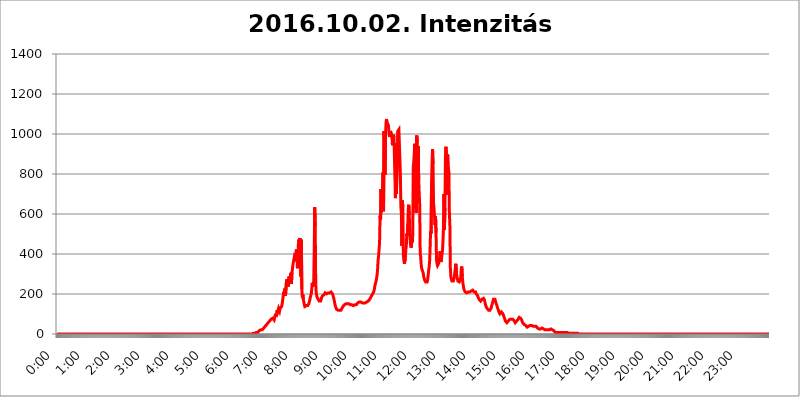
| Category | 2016.10.02. Intenzitás [W/m^2] |
|---|---|
| 0.0 | 0 |
| 0.0006944444444444445 | 0 |
| 0.001388888888888889 | 0 |
| 0.0020833333333333333 | 0 |
| 0.002777777777777778 | 0 |
| 0.003472222222222222 | 0 |
| 0.004166666666666667 | 0 |
| 0.004861111111111111 | 0 |
| 0.005555555555555556 | 0 |
| 0.0062499999999999995 | 0 |
| 0.006944444444444444 | 0 |
| 0.007638888888888889 | 0 |
| 0.008333333333333333 | 0 |
| 0.009027777777777779 | 0 |
| 0.009722222222222222 | 0 |
| 0.010416666666666666 | 0 |
| 0.011111111111111112 | 0 |
| 0.011805555555555555 | 0 |
| 0.012499999999999999 | 0 |
| 0.013194444444444444 | 0 |
| 0.013888888888888888 | 0 |
| 0.014583333333333332 | 0 |
| 0.015277777777777777 | 0 |
| 0.015972222222222224 | 0 |
| 0.016666666666666666 | 0 |
| 0.017361111111111112 | 0 |
| 0.018055555555555557 | 0 |
| 0.01875 | 0 |
| 0.019444444444444445 | 0 |
| 0.02013888888888889 | 0 |
| 0.020833333333333332 | 0 |
| 0.02152777777777778 | 0 |
| 0.022222222222222223 | 0 |
| 0.02291666666666667 | 0 |
| 0.02361111111111111 | 0 |
| 0.024305555555555556 | 0 |
| 0.024999999999999998 | 0 |
| 0.025694444444444447 | 0 |
| 0.02638888888888889 | 0 |
| 0.027083333333333334 | 0 |
| 0.027777777777777776 | 0 |
| 0.02847222222222222 | 0 |
| 0.029166666666666664 | 0 |
| 0.029861111111111113 | 0 |
| 0.030555555555555555 | 0 |
| 0.03125 | 0 |
| 0.03194444444444445 | 0 |
| 0.03263888888888889 | 0 |
| 0.03333333333333333 | 0 |
| 0.034027777777777775 | 0 |
| 0.034722222222222224 | 0 |
| 0.035416666666666666 | 0 |
| 0.036111111111111115 | 0 |
| 0.03680555555555556 | 0 |
| 0.0375 | 0 |
| 0.03819444444444444 | 0 |
| 0.03888888888888889 | 0 |
| 0.03958333333333333 | 0 |
| 0.04027777777777778 | 0 |
| 0.04097222222222222 | 0 |
| 0.041666666666666664 | 0 |
| 0.042361111111111106 | 0 |
| 0.04305555555555556 | 0 |
| 0.043750000000000004 | 0 |
| 0.044444444444444446 | 0 |
| 0.04513888888888889 | 0 |
| 0.04583333333333334 | 0 |
| 0.04652777777777778 | 0 |
| 0.04722222222222222 | 0 |
| 0.04791666666666666 | 0 |
| 0.04861111111111111 | 0 |
| 0.049305555555555554 | 0 |
| 0.049999999999999996 | 0 |
| 0.05069444444444445 | 0 |
| 0.051388888888888894 | 0 |
| 0.052083333333333336 | 0 |
| 0.05277777777777778 | 0 |
| 0.05347222222222222 | 0 |
| 0.05416666666666667 | 0 |
| 0.05486111111111111 | 0 |
| 0.05555555555555555 | 0 |
| 0.05625 | 0 |
| 0.05694444444444444 | 0 |
| 0.057638888888888885 | 0 |
| 0.05833333333333333 | 0 |
| 0.05902777777777778 | 0 |
| 0.059722222222222225 | 0 |
| 0.06041666666666667 | 0 |
| 0.061111111111111116 | 0 |
| 0.06180555555555556 | 0 |
| 0.0625 | 0 |
| 0.06319444444444444 | 0 |
| 0.06388888888888888 | 0 |
| 0.06458333333333334 | 0 |
| 0.06527777777777778 | 0 |
| 0.06597222222222222 | 0 |
| 0.06666666666666667 | 0 |
| 0.06736111111111111 | 0 |
| 0.06805555555555555 | 0 |
| 0.06874999999999999 | 0 |
| 0.06944444444444443 | 0 |
| 0.07013888888888889 | 0 |
| 0.07083333333333333 | 0 |
| 0.07152777777777779 | 0 |
| 0.07222222222222223 | 0 |
| 0.07291666666666667 | 0 |
| 0.07361111111111111 | 0 |
| 0.07430555555555556 | 0 |
| 0.075 | 0 |
| 0.07569444444444444 | 0 |
| 0.0763888888888889 | 0 |
| 0.07708333333333334 | 0 |
| 0.07777777777777778 | 0 |
| 0.07847222222222222 | 0 |
| 0.07916666666666666 | 0 |
| 0.0798611111111111 | 0 |
| 0.08055555555555556 | 0 |
| 0.08125 | 0 |
| 0.08194444444444444 | 0 |
| 0.08263888888888889 | 0 |
| 0.08333333333333333 | 0 |
| 0.08402777777777777 | 0 |
| 0.08472222222222221 | 0 |
| 0.08541666666666665 | 0 |
| 0.08611111111111112 | 0 |
| 0.08680555555555557 | 0 |
| 0.08750000000000001 | 0 |
| 0.08819444444444445 | 0 |
| 0.08888888888888889 | 0 |
| 0.08958333333333333 | 0 |
| 0.09027777777777778 | 0 |
| 0.09097222222222222 | 0 |
| 0.09166666666666667 | 0 |
| 0.09236111111111112 | 0 |
| 0.09305555555555556 | 0 |
| 0.09375 | 0 |
| 0.09444444444444444 | 0 |
| 0.09513888888888888 | 0 |
| 0.09583333333333333 | 0 |
| 0.09652777777777777 | 0 |
| 0.09722222222222222 | 0 |
| 0.09791666666666667 | 0 |
| 0.09861111111111111 | 0 |
| 0.09930555555555555 | 0 |
| 0.09999999999999999 | 0 |
| 0.10069444444444443 | 0 |
| 0.1013888888888889 | 0 |
| 0.10208333333333335 | 0 |
| 0.10277777777777779 | 0 |
| 0.10347222222222223 | 0 |
| 0.10416666666666667 | 0 |
| 0.10486111111111111 | 0 |
| 0.10555555555555556 | 0 |
| 0.10625 | 0 |
| 0.10694444444444444 | 0 |
| 0.1076388888888889 | 0 |
| 0.10833333333333334 | 0 |
| 0.10902777777777778 | 0 |
| 0.10972222222222222 | 0 |
| 0.1111111111111111 | 0 |
| 0.11180555555555556 | 0 |
| 0.11180555555555556 | 0 |
| 0.1125 | 0 |
| 0.11319444444444444 | 0 |
| 0.11388888888888889 | 0 |
| 0.11458333333333333 | 0 |
| 0.11527777777777777 | 0 |
| 0.11597222222222221 | 0 |
| 0.11666666666666665 | 0 |
| 0.1173611111111111 | 0 |
| 0.11805555555555557 | 0 |
| 0.11944444444444445 | 0 |
| 0.12013888888888889 | 0 |
| 0.12083333333333333 | 0 |
| 0.12152777777777778 | 0 |
| 0.12222222222222223 | 0 |
| 0.12291666666666667 | 0 |
| 0.12291666666666667 | 0 |
| 0.12361111111111112 | 0 |
| 0.12430555555555556 | 0 |
| 0.125 | 0 |
| 0.12569444444444444 | 0 |
| 0.12638888888888888 | 0 |
| 0.12708333333333333 | 0 |
| 0.16875 | 0 |
| 0.12847222222222224 | 0 |
| 0.12916666666666668 | 0 |
| 0.12986111111111112 | 0 |
| 0.13055555555555556 | 0 |
| 0.13125 | 0 |
| 0.13194444444444445 | 0 |
| 0.1326388888888889 | 0 |
| 0.13333333333333333 | 0 |
| 0.13402777777777777 | 0 |
| 0.13402777777777777 | 0 |
| 0.13472222222222222 | 0 |
| 0.13541666666666666 | 0 |
| 0.1361111111111111 | 0 |
| 0.13749999999999998 | 0 |
| 0.13819444444444443 | 0 |
| 0.1388888888888889 | 0 |
| 0.13958333333333334 | 0 |
| 0.14027777777777778 | 0 |
| 0.14097222222222222 | 0 |
| 0.14166666666666666 | 0 |
| 0.1423611111111111 | 0 |
| 0.14305555555555557 | 0 |
| 0.14375000000000002 | 0 |
| 0.14444444444444446 | 0 |
| 0.1451388888888889 | 0 |
| 0.1451388888888889 | 0 |
| 0.14652777777777778 | 0 |
| 0.14722222222222223 | 0 |
| 0.14791666666666667 | 0 |
| 0.1486111111111111 | 0 |
| 0.14930555555555555 | 0 |
| 0.15 | 0 |
| 0.15069444444444444 | 0 |
| 0.15138888888888888 | 0 |
| 0.15208333333333332 | 0 |
| 0.15277777777777776 | 0 |
| 0.15347222222222223 | 0 |
| 0.15416666666666667 | 0 |
| 0.15486111111111112 | 0 |
| 0.15555555555555556 | 0 |
| 0.15625 | 0 |
| 0.15694444444444444 | 0 |
| 0.15763888888888888 | 0 |
| 0.15833333333333333 | 0 |
| 0.15902777777777777 | 0 |
| 0.15972222222222224 | 0 |
| 0.16041666666666668 | 0 |
| 0.16111111111111112 | 0 |
| 0.16180555555555556 | 0 |
| 0.1625 | 0 |
| 0.16319444444444445 | 0 |
| 0.1638888888888889 | 0 |
| 0.16458333333333333 | 0 |
| 0.16527777777777777 | 0 |
| 0.16597222222222222 | 0 |
| 0.16666666666666666 | 0 |
| 0.1673611111111111 | 0 |
| 0.16805555555555554 | 0 |
| 0.16874999999999998 | 0 |
| 0.16944444444444443 | 0 |
| 0.17013888888888887 | 0 |
| 0.1708333333333333 | 0 |
| 0.17152777777777775 | 0 |
| 0.17222222222222225 | 0 |
| 0.1729166666666667 | 0 |
| 0.17361111111111113 | 0 |
| 0.17430555555555557 | 0 |
| 0.17500000000000002 | 0 |
| 0.17569444444444446 | 0 |
| 0.1763888888888889 | 0 |
| 0.17708333333333334 | 0 |
| 0.17777777777777778 | 0 |
| 0.17847222222222223 | 0 |
| 0.17916666666666667 | 0 |
| 0.1798611111111111 | 0 |
| 0.18055555555555555 | 0 |
| 0.18125 | 0 |
| 0.18194444444444444 | 0 |
| 0.1826388888888889 | 0 |
| 0.18333333333333335 | 0 |
| 0.1840277777777778 | 0 |
| 0.18472222222222223 | 0 |
| 0.18541666666666667 | 0 |
| 0.18611111111111112 | 0 |
| 0.18680555555555556 | 0 |
| 0.1875 | 0 |
| 0.18819444444444444 | 0 |
| 0.18888888888888888 | 0 |
| 0.18958333333333333 | 0 |
| 0.19027777777777777 | 0 |
| 0.1909722222222222 | 0 |
| 0.19166666666666665 | 0 |
| 0.19236111111111112 | 0 |
| 0.19305555555555554 | 0 |
| 0.19375 | 0 |
| 0.19444444444444445 | 0 |
| 0.1951388888888889 | 0 |
| 0.19583333333333333 | 0 |
| 0.19652777777777777 | 0 |
| 0.19722222222222222 | 0 |
| 0.19791666666666666 | 0 |
| 0.1986111111111111 | 0 |
| 0.19930555555555554 | 0 |
| 0.19999999999999998 | 0 |
| 0.20069444444444443 | 0 |
| 0.20138888888888887 | 0 |
| 0.2020833333333333 | 0 |
| 0.2027777777777778 | 0 |
| 0.2034722222222222 | 0 |
| 0.2041666666666667 | 0 |
| 0.20486111111111113 | 0 |
| 0.20555555555555557 | 0 |
| 0.20625000000000002 | 0 |
| 0.20694444444444446 | 0 |
| 0.2076388888888889 | 0 |
| 0.20833333333333334 | 0 |
| 0.20902777777777778 | 0 |
| 0.20972222222222223 | 0 |
| 0.21041666666666667 | 0 |
| 0.2111111111111111 | 0 |
| 0.21180555555555555 | 0 |
| 0.2125 | 0 |
| 0.21319444444444444 | 0 |
| 0.2138888888888889 | 0 |
| 0.21458333333333335 | 0 |
| 0.2152777777777778 | 0 |
| 0.21597222222222223 | 0 |
| 0.21666666666666667 | 0 |
| 0.21736111111111112 | 0 |
| 0.21805555555555556 | 0 |
| 0.21875 | 0 |
| 0.21944444444444444 | 0 |
| 0.22013888888888888 | 0 |
| 0.22083333333333333 | 0 |
| 0.22152777777777777 | 0 |
| 0.2222222222222222 | 0 |
| 0.22291666666666665 | 0 |
| 0.2236111111111111 | 0 |
| 0.22430555555555556 | 0 |
| 0.225 | 0 |
| 0.22569444444444445 | 0 |
| 0.2263888888888889 | 0 |
| 0.22708333333333333 | 0 |
| 0.22777777777777777 | 0 |
| 0.22847222222222222 | 0 |
| 0.22916666666666666 | 0 |
| 0.2298611111111111 | 0 |
| 0.23055555555555554 | 0 |
| 0.23124999999999998 | 0 |
| 0.23194444444444443 | 0 |
| 0.23263888888888887 | 0 |
| 0.2333333333333333 | 0 |
| 0.2340277777777778 | 0 |
| 0.2347222222222222 | 0 |
| 0.2354166666666667 | 0 |
| 0.23611111111111113 | 0 |
| 0.23680555555555557 | 0 |
| 0.23750000000000002 | 0 |
| 0.23819444444444446 | 0 |
| 0.2388888888888889 | 0 |
| 0.23958333333333334 | 0 |
| 0.24027777777777778 | 0 |
| 0.24097222222222223 | 0 |
| 0.24166666666666667 | 0 |
| 0.2423611111111111 | 0 |
| 0.24305555555555555 | 0 |
| 0.24375 | 0 |
| 0.24444444444444446 | 0 |
| 0.24513888888888888 | 0 |
| 0.24583333333333335 | 0 |
| 0.2465277777777778 | 0 |
| 0.24722222222222223 | 0 |
| 0.24791666666666667 | 0 |
| 0.24861111111111112 | 0 |
| 0.24930555555555556 | 0 |
| 0.25 | 0 |
| 0.25069444444444444 | 0 |
| 0.2513888888888889 | 0 |
| 0.2520833333333333 | 0 |
| 0.25277777777777777 | 0 |
| 0.2534722222222222 | 0 |
| 0.25416666666666665 | 0 |
| 0.2548611111111111 | 0 |
| 0.2555555555555556 | 0 |
| 0.25625000000000003 | 0 |
| 0.2569444444444445 | 0 |
| 0.2576388888888889 | 0 |
| 0.25833333333333336 | 0 |
| 0.2590277777777778 | 0 |
| 0.25972222222222224 | 0 |
| 0.2604166666666667 | 0 |
| 0.2611111111111111 | 0 |
| 0.26180555555555557 | 0 |
| 0.2625 | 0 |
| 0.26319444444444445 | 0 |
| 0.2638888888888889 | 0 |
| 0.26458333333333334 | 0 |
| 0.2652777777777778 | 0 |
| 0.2659722222222222 | 0 |
| 0.26666666666666666 | 0 |
| 0.2673611111111111 | 0 |
| 0.26805555555555555 | 0 |
| 0.26875 | 0 |
| 0.26944444444444443 | 0 |
| 0.2701388888888889 | 0 |
| 0.2708333333333333 | 0 |
| 0.27152777777777776 | 0 |
| 0.2722222222222222 | 3.525 |
| 0.27291666666666664 | 0 |
| 0.2736111111111111 | 3.525 |
| 0.2743055555555555 | 3.525 |
| 0.27499999999999997 | 3.525 |
| 0.27569444444444446 | 3.525 |
| 0.27638888888888885 | 3.525 |
| 0.27708333333333335 | 3.525 |
| 0.2777777777777778 | 3.525 |
| 0.27847222222222223 | 7.887 |
| 0.2791666666666667 | 7.887 |
| 0.2798611111111111 | 7.887 |
| 0.28055555555555556 | 7.887 |
| 0.28125 | 7.887 |
| 0.28194444444444444 | 12.257 |
| 0.2826388888888889 | 12.257 |
| 0.2833333333333333 | 16.636 |
| 0.28402777777777777 | 16.636 |
| 0.2847222222222222 | 21.024 |
| 0.28541666666666665 | 21.024 |
| 0.28611111111111115 | 21.024 |
| 0.28680555555555554 | 21.024 |
| 0.28750000000000003 | 21.024 |
| 0.2881944444444445 | 25.419 |
| 0.2888888888888889 | 25.419 |
| 0.28958333333333336 | 29.823 |
| 0.2902777777777778 | 29.823 |
| 0.29097222222222224 | 34.234 |
| 0.2916666666666667 | 38.653 |
| 0.2923611111111111 | 43.079 |
| 0.29305555555555557 | 43.079 |
| 0.29375 | 47.511 |
| 0.29444444444444445 | 47.511 |
| 0.2951388888888889 | 51.951 |
| 0.29583333333333334 | 56.398 |
| 0.2965277777777778 | 56.398 |
| 0.2972222222222222 | 60.85 |
| 0.29791666666666666 | 65.31 |
| 0.2986111111111111 | 65.31 |
| 0.29930555555555555 | 69.775 |
| 0.3 | 74.246 |
| 0.30069444444444443 | 74.246 |
| 0.3013888888888889 | 74.246 |
| 0.3020833333333333 | 78.722 |
| 0.30277777777777776 | 83.205 |
| 0.3034722222222222 | 78.722 |
| 0.30416666666666664 | 69.775 |
| 0.3048611111111111 | 74.246 |
| 0.3055555555555555 | 92.184 |
| 0.30624999999999997 | 101.184 |
| 0.3069444444444444 | 87.692 |
| 0.3076388888888889 | 101.184 |
| 0.30833333333333335 | 119.235 |
| 0.3090277777777778 | 110.201 |
| 0.30972222222222223 | 114.716 |
| 0.3104166666666667 | 128.284 |
| 0.3111111111111111 | 128.284 |
| 0.31180555555555556 | 114.716 |
| 0.3125 | 128.284 |
| 0.31319444444444444 | 123.758 |
| 0.3138888888888889 | 128.284 |
| 0.3145833333333333 | 137.347 |
| 0.31527777777777777 | 146.423 |
| 0.3159722222222222 | 150.964 |
| 0.31666666666666665 | 182.82 |
| 0.31736111111111115 | 205.62 |
| 0.31805555555555554 | 210.182 |
| 0.31875000000000003 | 214.746 |
| 0.3194444444444445 | 228.436 |
| 0.3201388888888889 | 191.937 |
| 0.32083333333333336 | 187.378 |
| 0.3215277777777778 | 264.932 |
| 0.32222222222222224 | 274.047 |
| 0.3229166666666667 | 269.49 |
| 0.3236111111111111 | 274.047 |
| 0.32430555555555557 | 237.564 |
| 0.325 | 287.709 |
| 0.32569444444444445 | 287.709 |
| 0.3263888888888889 | 274.047 |
| 0.32708333333333334 | 255.813 |
| 0.3277777777777778 | 305.898 |
| 0.3284722222222222 | 251.251 |
| 0.32916666666666666 | 305.898 |
| 0.3298611111111111 | 324.052 |
| 0.33055555555555555 | 346.682 |
| 0.33125 | 351.198 |
| 0.33194444444444443 | 373.729 |
| 0.3326388888888889 | 387.202 |
| 0.3333333333333333 | 387.202 |
| 0.3340277777777778 | 378.224 |
| 0.3347222222222222 | 405.108 |
| 0.3354166666666667 | 422.943 |
| 0.3361111111111111 | 387.202 |
| 0.3368055555555556 | 328.584 |
| 0.33749999999999997 | 387.202 |
| 0.33819444444444446 | 449.551 |
| 0.33888888888888885 | 471.582 |
| 0.33958333333333335 | 431.833 |
| 0.34027777777777773 | 480.356 |
| 0.34097222222222223 | 378.224 |
| 0.3416666666666666 | 287.709 |
| 0.3423611111111111 | 471.582 |
| 0.3430555555555555 | 223.873 |
| 0.34375 | 182.82 |
| 0.3444444444444445 | 196.497 |
| 0.3451388888888889 | 173.709 |
| 0.3458333333333334 | 160.056 |
| 0.34652777777777777 | 146.423 |
| 0.34722222222222227 | 137.347 |
| 0.34791666666666665 | 141.884 |
| 0.34861111111111115 | 141.884 |
| 0.34930555555555554 | 141.884 |
| 0.35000000000000003 | 141.884 |
| 0.3506944444444444 | 141.884 |
| 0.3513888888888889 | 141.884 |
| 0.3520833333333333 | 146.423 |
| 0.3527777777777778 | 150.964 |
| 0.3534722222222222 | 160.056 |
| 0.3541666666666667 | 169.156 |
| 0.3548611111111111 | 182.82 |
| 0.35555555555555557 | 182.82 |
| 0.35625 | 201.058 |
| 0.35694444444444445 | 223.873 |
| 0.3576388888888889 | 255.813 |
| 0.35833333333333334 | 237.564 |
| 0.3590277777777778 | 233 |
| 0.3597222222222222 | 260.373 |
| 0.36041666666666666 | 418.492 |
| 0.3611111111111111 | 634.105 |
| 0.36180555555555555 | 541.121 |
| 0.3625 | 255.813 |
| 0.36319444444444443 | 205.62 |
| 0.3638888888888889 | 191.937 |
| 0.3645833333333333 | 182.82 |
| 0.3652777777777778 | 178.264 |
| 0.3659722222222222 | 173.709 |
| 0.3666666666666667 | 169.156 |
| 0.3673611111111111 | 164.605 |
| 0.3680555555555556 | 164.605 |
| 0.36874999999999997 | 164.605 |
| 0.36944444444444446 | 164.605 |
| 0.37013888888888885 | 173.709 |
| 0.37083333333333335 | 182.82 |
| 0.37152777777777773 | 187.378 |
| 0.37222222222222223 | 191.937 |
| 0.3729166666666666 | 196.497 |
| 0.3736111111111111 | 191.937 |
| 0.3743055555555555 | 196.497 |
| 0.375 | 201.058 |
| 0.3756944444444445 | 205.62 |
| 0.3763888888888889 | 210.182 |
| 0.3770833333333334 | 205.62 |
| 0.37777777777777777 | 201.058 |
| 0.37847222222222227 | 201.058 |
| 0.37916666666666665 | 205.62 |
| 0.37986111111111115 | 205.62 |
| 0.38055555555555554 | 205.62 |
| 0.38125000000000003 | 205.62 |
| 0.3819444444444444 | 205.62 |
| 0.3826388888888889 | 205.62 |
| 0.3833333333333333 | 210.182 |
| 0.3840277777777778 | 210.182 |
| 0.3847222222222222 | 214.746 |
| 0.3854166666666667 | 210.182 |
| 0.3861111111111111 | 201.058 |
| 0.38680555555555557 | 196.497 |
| 0.3875 | 182.82 |
| 0.38819444444444445 | 173.709 |
| 0.3888888888888889 | 160.056 |
| 0.38958333333333334 | 146.423 |
| 0.3902777777777778 | 137.347 |
| 0.3909722222222222 | 132.814 |
| 0.39166666666666666 | 123.758 |
| 0.3923611111111111 | 119.235 |
| 0.39305555555555555 | 119.235 |
| 0.39375 | 119.235 |
| 0.39444444444444443 | 119.235 |
| 0.3951388888888889 | 119.235 |
| 0.3958333333333333 | 119.235 |
| 0.3965277777777778 | 119.235 |
| 0.3972222222222222 | 119.235 |
| 0.3979166666666667 | 119.235 |
| 0.3986111111111111 | 123.758 |
| 0.3993055555555556 | 128.284 |
| 0.39999999999999997 | 128.284 |
| 0.40069444444444446 | 137.347 |
| 0.40138888888888885 | 137.347 |
| 0.40208333333333335 | 141.884 |
| 0.40277777777777773 | 146.423 |
| 0.40347222222222223 | 146.423 |
| 0.4041666666666666 | 150.964 |
| 0.4048611111111111 | 150.964 |
| 0.4055555555555555 | 150.964 |
| 0.40625 | 150.964 |
| 0.4069444444444445 | 150.964 |
| 0.4076388888888889 | 150.964 |
| 0.4083333333333334 | 150.964 |
| 0.40902777777777777 | 150.964 |
| 0.40972222222222227 | 146.423 |
| 0.41041666666666665 | 150.964 |
| 0.41111111111111115 | 146.423 |
| 0.41180555555555554 | 146.423 |
| 0.41250000000000003 | 146.423 |
| 0.4131944444444444 | 146.423 |
| 0.4138888888888889 | 146.423 |
| 0.4145833333333333 | 141.884 |
| 0.4152777777777778 | 141.884 |
| 0.4159722222222222 | 141.884 |
| 0.4166666666666667 | 141.884 |
| 0.4173611111111111 | 146.423 |
| 0.41805555555555557 | 146.423 |
| 0.41875 | 146.423 |
| 0.41944444444444445 | 146.423 |
| 0.4201388888888889 | 150.964 |
| 0.42083333333333334 | 150.964 |
| 0.4215277777777778 | 155.509 |
| 0.4222222222222222 | 155.509 |
| 0.42291666666666666 | 155.509 |
| 0.4236111111111111 | 160.056 |
| 0.42430555555555555 | 160.056 |
| 0.425 | 160.056 |
| 0.42569444444444443 | 160.056 |
| 0.4263888888888889 | 155.509 |
| 0.4270833333333333 | 155.509 |
| 0.4277777777777778 | 155.509 |
| 0.4284722222222222 | 155.509 |
| 0.4291666666666667 | 155.509 |
| 0.4298611111111111 | 155.509 |
| 0.4305555555555556 | 155.509 |
| 0.43124999999999997 | 155.509 |
| 0.43194444444444446 | 155.509 |
| 0.43263888888888885 | 155.509 |
| 0.43333333333333335 | 155.509 |
| 0.43402777777777773 | 160.056 |
| 0.43472222222222223 | 160.056 |
| 0.4354166666666666 | 164.605 |
| 0.4361111111111111 | 164.605 |
| 0.4368055555555555 | 169.156 |
| 0.4375 | 169.156 |
| 0.4381944444444445 | 173.709 |
| 0.4388888888888889 | 178.264 |
| 0.4395833333333334 | 182.82 |
| 0.44027777777777777 | 187.378 |
| 0.44097222222222227 | 191.937 |
| 0.44166666666666665 | 196.497 |
| 0.44236111111111115 | 201.058 |
| 0.44305555555555554 | 205.62 |
| 0.44375000000000003 | 210.182 |
| 0.4444444444444444 | 219.309 |
| 0.4451388888888889 | 233 |
| 0.4458333333333333 | 246.689 |
| 0.4465277777777778 | 255.813 |
| 0.4472222222222222 | 264.932 |
| 0.4479166666666667 | 278.603 |
| 0.4486111111111111 | 296.808 |
| 0.44930555555555557 | 324.052 |
| 0.45 | 369.23 |
| 0.45069444444444445 | 391.685 |
| 0.4513888888888889 | 422.943 |
| 0.45208333333333334 | 458.38 |
| 0.4527777777777778 | 592.233 |
| 0.4534722222222222 | 571.049 |
| 0.45416666666666666 | 723.889 |
| 0.4548611111111111 | 609.062 |
| 0.45555555555555555 | 695.666 |
| 0.45625 | 675.311 |
| 0.45694444444444443 | 806.757 |
| 0.4576388888888889 | 613.252 |
| 0.4583333333333333 | 1014.852 |
| 0.4590277777777778 | 955.071 |
| 0.4597222222222222 | 795.074 |
| 0.4604166666666667 | 992.448 |
| 0.4611111111111111 | 1056.004 |
| 0.4618055555555556 | 1074.789 |
| 0.46249999999999997 | 1056.004 |
| 0.46319444444444446 | 1052.255 |
| 0.46388888888888885 | 1048.508 |
| 0.46458333333333335 | 1041.019 |
| 0.46527777777777773 | 1007.383 |
| 0.46597222222222223 | 984.98 |
| 0.4666666666666666 | 999.916 |
| 0.4673611111111111 | 1014.852 |
| 0.4680555555555555 | 1007.383 |
| 0.46875 | 999.916 |
| 0.4694444444444445 | 984.98 |
| 0.4701388888888889 | 943.832 |
| 0.4708333333333334 | 977.508 |
| 0.47152777777777777 | 996.182 |
| 0.47222222222222227 | 984.98 |
| 0.47291666666666665 | 984.98 |
| 0.47361111111111115 | 984.98 |
| 0.47430555555555554 | 679.395 |
| 0.47500000000000003 | 955.071 |
| 0.4756944444444444 | 699.717 |
| 0.4763888888888889 | 695.666 |
| 0.4770833333333333 | 703.762 |
| 0.4777777777777778 | 1014.852 |
| 0.4784722222222222 | 1014.852 |
| 0.4791666666666667 | 1022.323 |
| 0.4798611111111111 | 1022.323 |
| 0.48055555555555557 | 1018.587 |
| 0.48125 | 802.868 |
| 0.48194444444444445 | 638.256 |
| 0.4826388888888889 | 604.864 |
| 0.48333333333333334 | 440.702 |
| 0.4840277777777778 | 667.123 |
| 0.4847222222222222 | 634.105 |
| 0.48541666666666666 | 396.164 |
| 0.4861111111111111 | 369.23 |
| 0.48680555555555555 | 351.198 |
| 0.4875 | 355.712 |
| 0.48819444444444443 | 378.224 |
| 0.4888888888888889 | 422.943 |
| 0.4895833333333333 | 440.702 |
| 0.4902777777777778 | 502.192 |
| 0.4909722222222222 | 489.108 |
| 0.4916666666666667 | 549.704 |
| 0.4923611111111111 | 625.784 |
| 0.4930555555555556 | 646.537 |
| 0.49374999999999997 | 596.45 |
| 0.49444444444444446 | 497.836 |
| 0.49513888888888885 | 458.38 |
| 0.49583333333333335 | 440.702 |
| 0.49652777777777773 | 431.833 |
| 0.49722222222222223 | 467.187 |
| 0.4979166666666666 | 458.38 |
| 0.4986111111111111 | 502.192 |
| 0.4993055555555555 | 833.834 |
| 0.5 | 860.676 |
| 0.5006944444444444 | 902.447 |
| 0.5013888888888889 | 951.327 |
| 0.5020833333333333 | 625.784 |
| 0.5027777777777778 | 921.298 |
| 0.5034722222222222 | 604.864 |
| 0.5041666666666667 | 992.448 |
| 0.5048611111111111 | 962.555 |
| 0.5055555555555555 | 795.074 |
| 0.50625 | 940.082 |
| 0.5069444444444444 | 771.559 |
| 0.5076388888888889 | 703.762 |
| 0.5083333333333333 | 646.537 |
| 0.5090277777777777 | 405.108 |
| 0.5097222222222222 | 387.202 |
| 0.5104166666666666 | 346.682 |
| 0.5111111111111112 | 328.584 |
| 0.5118055555555555 | 333.113 |
| 0.5125000000000001 | 328.584 |
| 0.5131944444444444 | 305.898 |
| 0.513888888888889 | 287.709 |
| 0.5145833333333333 | 278.603 |
| 0.5152777777777778 | 269.49 |
| 0.5159722222222222 | 264.932 |
| 0.5166666666666667 | 260.373 |
| 0.517361111111111 | 260.373 |
| 0.5180555555555556 | 260.373 |
| 0.5187499999999999 | 260.373 |
| 0.5194444444444445 | 269.49 |
| 0.5201388888888888 | 292.259 |
| 0.5208333333333334 | 314.98 |
| 0.5215277777777778 | 333.113 |
| 0.5222222222222223 | 360.221 |
| 0.5229166666666667 | 427.39 |
| 0.5236111111111111 | 515.223 |
| 0.5243055555555556 | 502.192 |
| 0.525 | 759.723 |
| 0.5256944444444445 | 860.676 |
| 0.5263888888888889 | 925.06 |
| 0.5270833333333333 | 849.199 |
| 0.5277777777777778 | 650.667 |
| 0.5284722222222222 | 625.784 |
| 0.5291666666666667 | 629.948 |
| 0.5298611111111111 | 545.416 |
| 0.5305555555555556 | 588.009 |
| 0.53125 | 506.542 |
| 0.5319444444444444 | 369.23 |
| 0.5326388888888889 | 351.198 |
| 0.5333333333333333 | 342.162 |
| 0.5340277777777778 | 346.682 |
| 0.5347222222222222 | 351.198 |
| 0.5354166666666667 | 360.221 |
| 0.5361111111111111 | 373.729 |
| 0.5368055555555555 | 414.035 |
| 0.5375 | 396.164 |
| 0.5381944444444444 | 360.221 |
| 0.5388888888888889 | 378.224 |
| 0.5395833333333333 | 400.638 |
| 0.5402777777777777 | 414.035 |
| 0.5409722222222222 | 462.786 |
| 0.5416666666666666 | 528.2 |
| 0.5423611111111112 | 699.717 |
| 0.5430555555555555 | 519.555 |
| 0.5437500000000001 | 629.948 |
| 0.5444444444444444 | 883.516 |
| 0.545138888888889 | 936.33 |
| 0.5458333333333333 | 891.099 |
| 0.5465277777777778 | 695.666 |
| 0.5472222222222222 | 898.668 |
| 0.5479166666666667 | 887.309 |
| 0.548611111111111 | 829.981 |
| 0.5493055555555556 | 806.757 |
| 0.5499999999999999 | 604.864 |
| 0.5506944444444445 | 541.121 |
| 0.5513888888888888 | 324.052 |
| 0.5520833333333334 | 287.709 |
| 0.5527777777777778 | 274.047 |
| 0.5534722222222223 | 264.932 |
| 0.5541666666666667 | 260.373 |
| 0.5548611111111111 | 264.932 |
| 0.5555555555555556 | 264.932 |
| 0.55625 | 269.49 |
| 0.5569444444444445 | 283.156 |
| 0.5576388888888889 | 310.44 |
| 0.5583333333333333 | 328.584 |
| 0.5590277777777778 | 351.198 |
| 0.5597222222222222 | 319.517 |
| 0.5604166666666667 | 287.709 |
| 0.5611111111111111 | 278.603 |
| 0.5618055555555556 | 264.932 |
| 0.5625 | 260.373 |
| 0.5631944444444444 | 260.373 |
| 0.5638888888888889 | 260.373 |
| 0.5645833333333333 | 264.932 |
| 0.5652777777777778 | 269.49 |
| 0.5659722222222222 | 287.709 |
| 0.5666666666666667 | 324.052 |
| 0.5673611111111111 | 337.639 |
| 0.5680555555555555 | 287.709 |
| 0.56875 | 260.373 |
| 0.5694444444444444 | 242.127 |
| 0.5701388888888889 | 228.436 |
| 0.5708333333333333 | 219.309 |
| 0.5715277777777777 | 214.746 |
| 0.5722222222222222 | 210.182 |
| 0.5729166666666666 | 210.182 |
| 0.5736111111111112 | 210.182 |
| 0.5743055555555555 | 205.62 |
| 0.5750000000000001 | 205.62 |
| 0.5756944444444444 | 205.62 |
| 0.576388888888889 | 210.182 |
| 0.5770833333333333 | 210.182 |
| 0.5777777777777778 | 210.182 |
| 0.5784722222222222 | 210.182 |
| 0.5791666666666667 | 210.182 |
| 0.579861111111111 | 214.746 |
| 0.5805555555555556 | 214.746 |
| 0.5812499999999999 | 219.309 |
| 0.5819444444444445 | 219.309 |
| 0.5826388888888888 | 219.309 |
| 0.5833333333333334 | 219.309 |
| 0.5840277777777778 | 214.746 |
| 0.5847222222222223 | 210.182 |
| 0.5854166666666667 | 210.182 |
| 0.5861111111111111 | 210.182 |
| 0.5868055555555556 | 210.182 |
| 0.5875 | 201.058 |
| 0.5881944444444445 | 201.058 |
| 0.5888888888888889 | 201.058 |
| 0.5895833333333333 | 191.937 |
| 0.5902777777777778 | 182.82 |
| 0.5909722222222222 | 178.264 |
| 0.5916666666666667 | 173.709 |
| 0.5923611111111111 | 169.156 |
| 0.5930555555555556 | 169.156 |
| 0.59375 | 164.605 |
| 0.5944444444444444 | 164.605 |
| 0.5951388888888889 | 169.156 |
| 0.5958333333333333 | 173.709 |
| 0.5965277777777778 | 173.709 |
| 0.5972222222222222 | 178.264 |
| 0.5979166666666667 | 178.264 |
| 0.5986111111111111 | 173.709 |
| 0.5993055555555555 | 169.156 |
| 0.6 | 155.509 |
| 0.6006944444444444 | 146.423 |
| 0.6013888888888889 | 137.347 |
| 0.6020833333333333 | 132.814 |
| 0.6027777777777777 | 128.284 |
| 0.6034722222222222 | 123.758 |
| 0.6041666666666666 | 123.758 |
| 0.6048611111111112 | 119.235 |
| 0.6055555555555555 | 119.235 |
| 0.6062500000000001 | 119.235 |
| 0.6069444444444444 | 119.235 |
| 0.607638888888889 | 123.758 |
| 0.6083333333333333 | 128.284 |
| 0.6090277777777778 | 137.347 |
| 0.6097222222222222 | 146.423 |
| 0.6104166666666667 | 155.509 |
| 0.611111111111111 | 164.605 |
| 0.6118055555555556 | 173.709 |
| 0.6124999999999999 | 173.709 |
| 0.6131944444444445 | 173.709 |
| 0.6138888888888888 | 173.709 |
| 0.6145833333333334 | 169.156 |
| 0.6152777777777778 | 155.509 |
| 0.6159722222222223 | 150.964 |
| 0.6166666666666667 | 141.884 |
| 0.6173611111111111 | 132.814 |
| 0.6180555555555556 | 128.284 |
| 0.61875 | 119.235 |
| 0.6194444444444445 | 110.201 |
| 0.6201388888888889 | 105.69 |
| 0.6208333333333333 | 101.184 |
| 0.6215277777777778 | 105.69 |
| 0.6222222222222222 | 105.69 |
| 0.6229166666666667 | 110.201 |
| 0.6236111111111111 | 110.201 |
| 0.6243055555555556 | 110.201 |
| 0.625 | 101.184 |
| 0.6256944444444444 | 96.682 |
| 0.6263888888888889 | 87.692 |
| 0.6270833333333333 | 83.205 |
| 0.6277777777777778 | 74.246 |
| 0.6284722222222222 | 65.31 |
| 0.6291666666666667 | 65.31 |
| 0.6298611111111111 | 60.85 |
| 0.6305555555555555 | 56.398 |
| 0.63125 | 60.85 |
| 0.6319444444444444 | 60.85 |
| 0.6326388888888889 | 65.31 |
| 0.6333333333333333 | 65.31 |
| 0.6340277777777777 | 69.775 |
| 0.6347222222222222 | 74.246 |
| 0.6354166666666666 | 74.246 |
| 0.6361111111111112 | 74.246 |
| 0.6368055555555555 | 74.246 |
| 0.6375000000000001 | 78.722 |
| 0.6381944444444444 | 74.246 |
| 0.638888888888889 | 74.246 |
| 0.6395833333333333 | 74.246 |
| 0.6402777777777778 | 69.775 |
| 0.6409722222222222 | 65.31 |
| 0.6416666666666667 | 60.85 |
| 0.642361111111111 | 56.398 |
| 0.6430555555555556 | 60.85 |
| 0.6437499999999999 | 60.85 |
| 0.6444444444444445 | 65.31 |
| 0.6451388888888888 | 65.31 |
| 0.6458333333333334 | 69.775 |
| 0.6465277777777778 | 74.246 |
| 0.6472222222222223 | 78.722 |
| 0.6479166666666667 | 83.205 |
| 0.6486111111111111 | 83.205 |
| 0.6493055555555556 | 83.205 |
| 0.65 | 78.722 |
| 0.6506944444444445 | 74.246 |
| 0.6513888888888889 | 69.775 |
| 0.6520833333333333 | 65.31 |
| 0.6527777777777778 | 56.398 |
| 0.6534722222222222 | 56.398 |
| 0.6541666666666667 | 51.951 |
| 0.6548611111111111 | 47.511 |
| 0.6555555555555556 | 47.511 |
| 0.65625 | 43.079 |
| 0.6569444444444444 | 43.079 |
| 0.6576388888888889 | 38.653 |
| 0.6583333333333333 | 38.653 |
| 0.6590277777777778 | 34.234 |
| 0.6597222222222222 | 34.234 |
| 0.6604166666666667 | 34.234 |
| 0.6611111111111111 | 38.653 |
| 0.6618055555555555 | 38.653 |
| 0.6625 | 38.653 |
| 0.6631944444444444 | 43.079 |
| 0.6638888888888889 | 43.079 |
| 0.6645833333333333 | 43.079 |
| 0.6652777777777777 | 43.079 |
| 0.6659722222222222 | 38.653 |
| 0.6666666666666666 | 38.653 |
| 0.6673611111111111 | 38.653 |
| 0.6680555555555556 | 38.653 |
| 0.6687500000000001 | 38.653 |
| 0.6694444444444444 | 38.653 |
| 0.6701388888888888 | 43.079 |
| 0.6708333333333334 | 38.653 |
| 0.6715277777777778 | 38.653 |
| 0.6722222222222222 | 34.234 |
| 0.6729166666666666 | 34.234 |
| 0.6736111111111112 | 29.823 |
| 0.6743055555555556 | 29.823 |
| 0.6749999999999999 | 29.823 |
| 0.6756944444444444 | 25.419 |
| 0.6763888888888889 | 25.419 |
| 0.6770833333333334 | 25.419 |
| 0.6777777777777777 | 25.419 |
| 0.6784722222222223 | 25.419 |
| 0.6791666666666667 | 29.823 |
| 0.6798611111111111 | 29.823 |
| 0.6805555555555555 | 25.419 |
| 0.68125 | 25.419 |
| 0.6819444444444445 | 25.419 |
| 0.6826388888888889 | 21.024 |
| 0.6833333333333332 | 21.024 |
| 0.6840277777777778 | 21.024 |
| 0.6847222222222222 | 21.024 |
| 0.6854166666666667 | 21.024 |
| 0.686111111111111 | 21.024 |
| 0.6868055555555556 | 21.024 |
| 0.6875 | 21.024 |
| 0.6881944444444444 | 21.024 |
| 0.688888888888889 | 21.024 |
| 0.6895833333333333 | 21.024 |
| 0.6902777777777778 | 21.024 |
| 0.6909722222222222 | 25.419 |
| 0.6916666666666668 | 25.419 |
| 0.6923611111111111 | 25.419 |
| 0.6930555555555555 | 25.419 |
| 0.69375 | 25.419 |
| 0.6944444444444445 | 21.024 |
| 0.6951388888888889 | 21.024 |
| 0.6958333333333333 | 16.636 |
| 0.6965277777777777 | 16.636 |
| 0.6972222222222223 | 12.257 |
| 0.6979166666666666 | 12.257 |
| 0.6986111111111111 | 7.887 |
| 0.6993055555555556 | 7.887 |
| 0.7000000000000001 | 7.887 |
| 0.7006944444444444 | 7.887 |
| 0.7013888888888888 | 7.887 |
| 0.7020833333333334 | 7.887 |
| 0.7027777777777778 | 7.887 |
| 0.7034722222222222 | 7.887 |
| 0.7041666666666666 | 7.887 |
| 0.7048611111111112 | 7.887 |
| 0.7055555555555556 | 7.887 |
| 0.7062499999999999 | 7.887 |
| 0.7069444444444444 | 7.887 |
| 0.7076388888888889 | 7.887 |
| 0.7083333333333334 | 7.887 |
| 0.7090277777777777 | 7.887 |
| 0.7097222222222223 | 7.887 |
| 0.7104166666666667 | 7.887 |
| 0.7111111111111111 | 7.887 |
| 0.7118055555555555 | 7.887 |
| 0.7125 | 7.887 |
| 0.7131944444444445 | 7.887 |
| 0.7138888888888889 | 7.887 |
| 0.7145833333333332 | 7.887 |
| 0.7152777777777778 | 7.887 |
| 0.7159722222222222 | 7.887 |
| 0.7166666666666667 | 7.887 |
| 0.717361111111111 | 3.525 |
| 0.7180555555555556 | 3.525 |
| 0.71875 | 3.525 |
| 0.7194444444444444 | 3.525 |
| 0.720138888888889 | 3.525 |
| 0.7208333333333333 | 3.525 |
| 0.7215277777777778 | 3.525 |
| 0.7222222222222222 | 3.525 |
| 0.7229166666666668 | 3.525 |
| 0.7236111111111111 | 3.525 |
| 0.7243055555555555 | 3.525 |
| 0.725 | 3.525 |
| 0.7256944444444445 | 3.525 |
| 0.7263888888888889 | 3.525 |
| 0.7270833333333333 | 3.525 |
| 0.7277777777777777 | 3.525 |
| 0.7284722222222223 | 3.525 |
| 0.7291666666666666 | 0 |
| 0.7298611111111111 | 3.525 |
| 0.7305555555555556 | 0 |
| 0.7312500000000001 | 0 |
| 0.7319444444444444 | 0 |
| 0.7326388888888888 | 0 |
| 0.7333333333333334 | 0 |
| 0.7340277777777778 | 0 |
| 0.7347222222222222 | 0 |
| 0.7354166666666666 | 0 |
| 0.7361111111111112 | 0 |
| 0.7368055555555556 | 0 |
| 0.7374999999999999 | 0 |
| 0.7381944444444444 | 0 |
| 0.7388888888888889 | 0 |
| 0.7395833333333334 | 0 |
| 0.7402777777777777 | 0 |
| 0.7409722222222223 | 0 |
| 0.7416666666666667 | 0 |
| 0.7423611111111111 | 0 |
| 0.7430555555555555 | 0 |
| 0.74375 | 0 |
| 0.7444444444444445 | 0 |
| 0.7451388888888889 | 0 |
| 0.7458333333333332 | 0 |
| 0.7465277777777778 | 0 |
| 0.7472222222222222 | 0 |
| 0.7479166666666667 | 0 |
| 0.748611111111111 | 0 |
| 0.7493055555555556 | 0 |
| 0.75 | 0 |
| 0.7506944444444444 | 0 |
| 0.751388888888889 | 0 |
| 0.7520833333333333 | 0 |
| 0.7527777777777778 | 0 |
| 0.7534722222222222 | 0 |
| 0.7541666666666668 | 0 |
| 0.7548611111111111 | 0 |
| 0.7555555555555555 | 0 |
| 0.75625 | 0 |
| 0.7569444444444445 | 0 |
| 0.7576388888888889 | 0 |
| 0.7583333333333333 | 0 |
| 0.7590277777777777 | 0 |
| 0.7597222222222223 | 0 |
| 0.7604166666666666 | 0 |
| 0.7611111111111111 | 0 |
| 0.7618055555555556 | 0 |
| 0.7625000000000001 | 0 |
| 0.7631944444444444 | 0 |
| 0.7638888888888888 | 0 |
| 0.7645833333333334 | 0 |
| 0.7652777777777778 | 0 |
| 0.7659722222222222 | 0 |
| 0.7666666666666666 | 0 |
| 0.7673611111111112 | 0 |
| 0.7680555555555556 | 0 |
| 0.7687499999999999 | 0 |
| 0.7694444444444444 | 0 |
| 0.7701388888888889 | 0 |
| 0.7708333333333334 | 0 |
| 0.7715277777777777 | 0 |
| 0.7722222222222223 | 0 |
| 0.7729166666666667 | 0 |
| 0.7736111111111111 | 0 |
| 0.7743055555555555 | 0 |
| 0.775 | 0 |
| 0.7756944444444445 | 0 |
| 0.7763888888888889 | 0 |
| 0.7770833333333332 | 0 |
| 0.7777777777777778 | 0 |
| 0.7784722222222222 | 0 |
| 0.7791666666666667 | 0 |
| 0.779861111111111 | 0 |
| 0.7805555555555556 | 0 |
| 0.78125 | 0 |
| 0.7819444444444444 | 0 |
| 0.782638888888889 | 0 |
| 0.7833333333333333 | 0 |
| 0.7840277777777778 | 0 |
| 0.7847222222222222 | 0 |
| 0.7854166666666668 | 0 |
| 0.7861111111111111 | 0 |
| 0.7868055555555555 | 0 |
| 0.7875 | 0 |
| 0.7881944444444445 | 0 |
| 0.7888888888888889 | 0 |
| 0.7895833333333333 | 0 |
| 0.7902777777777777 | 0 |
| 0.7909722222222223 | 0 |
| 0.7916666666666666 | 0 |
| 0.7923611111111111 | 0 |
| 0.7930555555555556 | 0 |
| 0.7937500000000001 | 0 |
| 0.7944444444444444 | 0 |
| 0.7951388888888888 | 0 |
| 0.7958333333333334 | 0 |
| 0.7965277777777778 | 0 |
| 0.7972222222222222 | 0 |
| 0.7979166666666666 | 0 |
| 0.7986111111111112 | 0 |
| 0.7993055555555556 | 0 |
| 0.7999999999999999 | 0 |
| 0.8006944444444444 | 0 |
| 0.8013888888888889 | 0 |
| 0.8020833333333334 | 0 |
| 0.8027777777777777 | 0 |
| 0.8034722222222223 | 0 |
| 0.8041666666666667 | 0 |
| 0.8048611111111111 | 0 |
| 0.8055555555555555 | 0 |
| 0.80625 | 0 |
| 0.8069444444444445 | 0 |
| 0.8076388888888889 | 0 |
| 0.8083333333333332 | 0 |
| 0.8090277777777778 | 0 |
| 0.8097222222222222 | 0 |
| 0.8104166666666667 | 0 |
| 0.811111111111111 | 0 |
| 0.8118055555555556 | 0 |
| 0.8125 | 0 |
| 0.8131944444444444 | 0 |
| 0.813888888888889 | 0 |
| 0.8145833333333333 | 0 |
| 0.8152777777777778 | 0 |
| 0.8159722222222222 | 0 |
| 0.8166666666666668 | 0 |
| 0.8173611111111111 | 0 |
| 0.8180555555555555 | 0 |
| 0.81875 | 0 |
| 0.8194444444444445 | 0 |
| 0.8201388888888889 | 0 |
| 0.8208333333333333 | 0 |
| 0.8215277777777777 | 0 |
| 0.8222222222222223 | 0 |
| 0.8229166666666666 | 0 |
| 0.8236111111111111 | 0 |
| 0.8243055555555556 | 0 |
| 0.8250000000000001 | 0 |
| 0.8256944444444444 | 0 |
| 0.8263888888888888 | 0 |
| 0.8270833333333334 | 0 |
| 0.8277777777777778 | 0 |
| 0.8284722222222222 | 0 |
| 0.8291666666666666 | 0 |
| 0.8298611111111112 | 0 |
| 0.8305555555555556 | 0 |
| 0.8312499999999999 | 0 |
| 0.8319444444444444 | 0 |
| 0.8326388888888889 | 0 |
| 0.8333333333333334 | 0 |
| 0.8340277777777777 | 0 |
| 0.8347222222222223 | 0 |
| 0.8354166666666667 | 0 |
| 0.8361111111111111 | 0 |
| 0.8368055555555555 | 0 |
| 0.8375 | 0 |
| 0.8381944444444445 | 0 |
| 0.8388888888888889 | 0 |
| 0.8395833333333332 | 0 |
| 0.8402777777777778 | 0 |
| 0.8409722222222222 | 0 |
| 0.8416666666666667 | 0 |
| 0.842361111111111 | 0 |
| 0.8430555555555556 | 0 |
| 0.84375 | 0 |
| 0.8444444444444444 | 0 |
| 0.845138888888889 | 0 |
| 0.8458333333333333 | 0 |
| 0.8465277777777778 | 0 |
| 0.8472222222222222 | 0 |
| 0.8479166666666668 | 0 |
| 0.8486111111111111 | 0 |
| 0.8493055555555555 | 0 |
| 0.85 | 0 |
| 0.8506944444444445 | 0 |
| 0.8513888888888889 | 0 |
| 0.8520833333333333 | 0 |
| 0.8527777777777777 | 0 |
| 0.8534722222222223 | 0 |
| 0.8541666666666666 | 0 |
| 0.8548611111111111 | 0 |
| 0.8555555555555556 | 0 |
| 0.8562500000000001 | 0 |
| 0.8569444444444444 | 0 |
| 0.8576388888888888 | 0 |
| 0.8583333333333334 | 0 |
| 0.8590277777777778 | 0 |
| 0.8597222222222222 | 0 |
| 0.8604166666666666 | 0 |
| 0.8611111111111112 | 0 |
| 0.8618055555555556 | 0 |
| 0.8624999999999999 | 0 |
| 0.8631944444444444 | 0 |
| 0.8638888888888889 | 0 |
| 0.8645833333333334 | 0 |
| 0.8652777777777777 | 0 |
| 0.8659722222222223 | 0 |
| 0.8666666666666667 | 0 |
| 0.8673611111111111 | 0 |
| 0.8680555555555555 | 0 |
| 0.86875 | 0 |
| 0.8694444444444445 | 0 |
| 0.8701388888888889 | 0 |
| 0.8708333333333332 | 0 |
| 0.8715277777777778 | 0 |
| 0.8722222222222222 | 0 |
| 0.8729166666666667 | 0 |
| 0.873611111111111 | 0 |
| 0.8743055555555556 | 0 |
| 0.875 | 0 |
| 0.8756944444444444 | 0 |
| 0.876388888888889 | 0 |
| 0.8770833333333333 | 0 |
| 0.8777777777777778 | 0 |
| 0.8784722222222222 | 0 |
| 0.8791666666666668 | 0 |
| 0.8798611111111111 | 0 |
| 0.8805555555555555 | 0 |
| 0.88125 | 0 |
| 0.8819444444444445 | 0 |
| 0.8826388888888889 | 0 |
| 0.8833333333333333 | 0 |
| 0.8840277777777777 | 0 |
| 0.8847222222222223 | 0 |
| 0.8854166666666666 | 0 |
| 0.8861111111111111 | 0 |
| 0.8868055555555556 | 0 |
| 0.8875000000000001 | 0 |
| 0.8881944444444444 | 0 |
| 0.8888888888888888 | 0 |
| 0.8895833333333334 | 0 |
| 0.8902777777777778 | 0 |
| 0.8909722222222222 | 0 |
| 0.8916666666666666 | 0 |
| 0.8923611111111112 | 0 |
| 0.8930555555555556 | 0 |
| 0.8937499999999999 | 0 |
| 0.8944444444444444 | 0 |
| 0.8951388888888889 | 0 |
| 0.8958333333333334 | 0 |
| 0.8965277777777777 | 0 |
| 0.8972222222222223 | 0 |
| 0.8979166666666667 | 0 |
| 0.8986111111111111 | 0 |
| 0.8993055555555555 | 0 |
| 0.9 | 0 |
| 0.9006944444444445 | 0 |
| 0.9013888888888889 | 0 |
| 0.9020833333333332 | 0 |
| 0.9027777777777778 | 0 |
| 0.9034722222222222 | 0 |
| 0.9041666666666667 | 0 |
| 0.904861111111111 | 0 |
| 0.9055555555555556 | 0 |
| 0.90625 | 0 |
| 0.9069444444444444 | 0 |
| 0.907638888888889 | 0 |
| 0.9083333333333333 | 0 |
| 0.9090277777777778 | 0 |
| 0.9097222222222222 | 0 |
| 0.9104166666666668 | 0 |
| 0.9111111111111111 | 0 |
| 0.9118055555555555 | 0 |
| 0.9125 | 0 |
| 0.9131944444444445 | 0 |
| 0.9138888888888889 | 0 |
| 0.9145833333333333 | 0 |
| 0.9152777777777777 | 0 |
| 0.9159722222222223 | 0 |
| 0.9166666666666666 | 0 |
| 0.9173611111111111 | 0 |
| 0.9180555555555556 | 0 |
| 0.9187500000000001 | 0 |
| 0.9194444444444444 | 0 |
| 0.9201388888888888 | 0 |
| 0.9208333333333334 | 0 |
| 0.9215277777777778 | 0 |
| 0.9222222222222222 | 0 |
| 0.9229166666666666 | 0 |
| 0.9236111111111112 | 0 |
| 0.9243055555555556 | 0 |
| 0.9249999999999999 | 0 |
| 0.9256944444444444 | 0 |
| 0.9263888888888889 | 0 |
| 0.9270833333333334 | 0 |
| 0.9277777777777777 | 0 |
| 0.9284722222222223 | 0 |
| 0.9291666666666667 | 0 |
| 0.9298611111111111 | 0 |
| 0.9305555555555555 | 0 |
| 0.93125 | 0 |
| 0.9319444444444445 | 0 |
| 0.9326388888888889 | 0 |
| 0.9333333333333332 | 0 |
| 0.9340277777777778 | 0 |
| 0.9347222222222222 | 0 |
| 0.9354166666666667 | 0 |
| 0.936111111111111 | 0 |
| 0.9368055555555556 | 0 |
| 0.9375 | 0 |
| 0.9381944444444444 | 0 |
| 0.938888888888889 | 0 |
| 0.9395833333333333 | 0 |
| 0.9402777777777778 | 0 |
| 0.9409722222222222 | 0 |
| 0.9416666666666668 | 0 |
| 0.9423611111111111 | 0 |
| 0.9430555555555555 | 0 |
| 0.94375 | 0 |
| 0.9444444444444445 | 0 |
| 0.9451388888888889 | 0 |
| 0.9458333333333333 | 0 |
| 0.9465277777777777 | 0 |
| 0.9472222222222223 | 0 |
| 0.9479166666666666 | 0 |
| 0.9486111111111111 | 0 |
| 0.9493055555555556 | 0 |
| 0.9500000000000001 | 0 |
| 0.9506944444444444 | 0 |
| 0.9513888888888888 | 0 |
| 0.9520833333333334 | 0 |
| 0.9527777777777778 | 0 |
| 0.9534722222222222 | 0 |
| 0.9541666666666666 | 0 |
| 0.9548611111111112 | 0 |
| 0.9555555555555556 | 0 |
| 0.9562499999999999 | 0 |
| 0.9569444444444444 | 0 |
| 0.9576388888888889 | 0 |
| 0.9583333333333334 | 0 |
| 0.9590277777777777 | 0 |
| 0.9597222222222223 | 0 |
| 0.9604166666666667 | 0 |
| 0.9611111111111111 | 0 |
| 0.9618055555555555 | 0 |
| 0.9625 | 0 |
| 0.9631944444444445 | 0 |
| 0.9638888888888889 | 0 |
| 0.9645833333333332 | 0 |
| 0.9652777777777778 | 0 |
| 0.9659722222222222 | 0 |
| 0.9666666666666667 | 0 |
| 0.967361111111111 | 0 |
| 0.9680555555555556 | 0 |
| 0.96875 | 0 |
| 0.9694444444444444 | 0 |
| 0.970138888888889 | 0 |
| 0.9708333333333333 | 0 |
| 0.9715277777777778 | 0 |
| 0.9722222222222222 | 0 |
| 0.9729166666666668 | 0 |
| 0.9736111111111111 | 0 |
| 0.9743055555555555 | 0 |
| 0.975 | 0 |
| 0.9756944444444445 | 0 |
| 0.9763888888888889 | 0 |
| 0.9770833333333333 | 0 |
| 0.9777777777777777 | 0 |
| 0.9784722222222223 | 0 |
| 0.9791666666666666 | 0 |
| 0.9798611111111111 | 0 |
| 0.9805555555555556 | 0 |
| 0.9812500000000001 | 0 |
| 0.9819444444444444 | 0 |
| 0.9826388888888888 | 0 |
| 0.9833333333333334 | 0 |
| 0.9840277777777778 | 0 |
| 0.9847222222222222 | 0 |
| 0.9854166666666666 | 0 |
| 0.9861111111111112 | 0 |
| 0.9868055555555556 | 0 |
| 0.9874999999999999 | 0 |
| 0.9881944444444444 | 0 |
| 0.9888888888888889 | 0 |
| 0.9895833333333334 | 0 |
| 0.9902777777777777 | 0 |
| 0.9909722222222223 | 0 |
| 0.9916666666666667 | 0 |
| 0.9923611111111111 | 0 |
| 0.9930555555555555 | 0 |
| 0.99375 | 0 |
| 0.9944444444444445 | 0 |
| 0.9951388888888889 | 0 |
| 0.9958333333333332 | 0 |
| 0.9965277777777778 | 0 |
| 0.9972222222222222 | 0 |
| 0.9979166666666667 | 0 |
| 0.998611111111111 | 0 |
| 0.9993055555555556 | 0 |